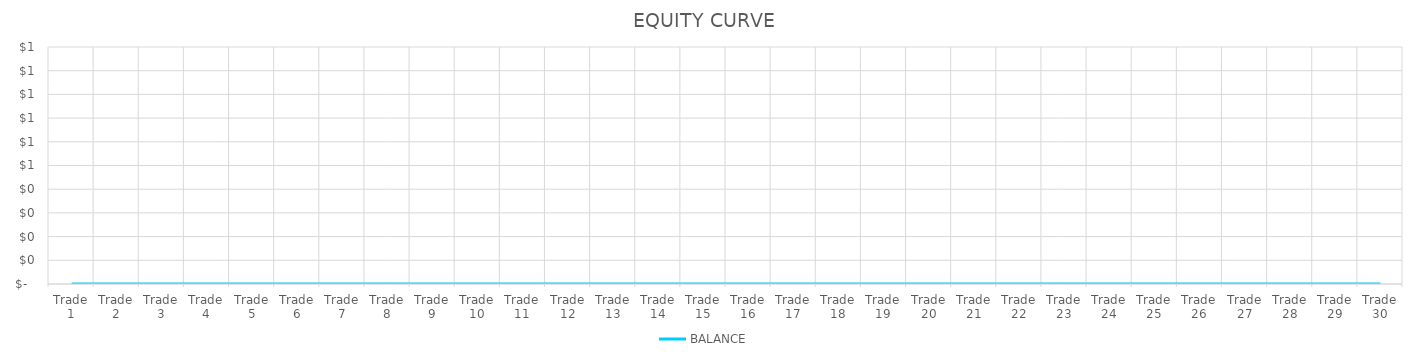
| Category | BALANCE |
|---|---|
| Trade 1 | 0 |
| Trade 2 | 0 |
| Trade 3 | 0 |
| Trade 4 | 0 |
| Trade 5 | 0 |
| Trade 6 | 0 |
| Trade 7 | 0 |
| Trade 8 | 0 |
| Trade 9 | 0 |
| Trade 10 | 0 |
| Trade 11 | 0 |
| Trade 12 | 0 |
| Trade 13 | 0 |
| Trade 14 | 0 |
| Trade 15 | 0 |
| Trade 16 | 0 |
| Trade 17 | 0 |
| Trade 18 | 0 |
| Trade 19 | 0 |
| Trade 20 | 0 |
| Trade 21 | 0 |
| Trade 22 | 0 |
| Trade 23 | 0 |
| Trade 24 | 0 |
| Trade 25 | 0 |
| Trade 26 | 0 |
| Trade 27 | 0 |
| Trade 28 | 0 |
| Trade 29 | 0 |
| Trade 30 | 0 |